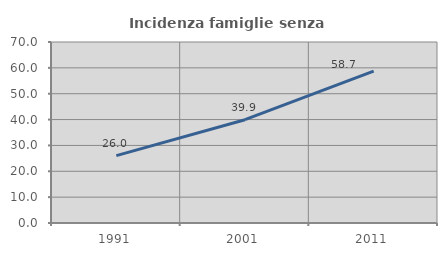
| Category | Incidenza famiglie senza nuclei |
|---|---|
| 1991.0 | 26.036 |
| 2001.0 | 39.943 |
| 2011.0 | 58.743 |